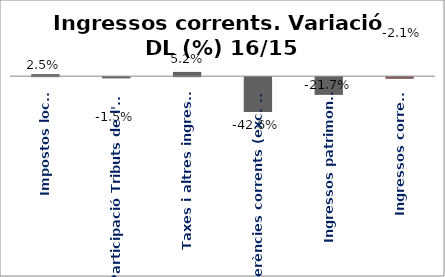
| Category | Series 0 |
|---|---|
| Impostos locals | 0.025 |
| Participació Tributs de l'Estat | -0.015 |
| Taxes i altres ingressos | 0.052 |
| Transferències corrents (exc. FCF) | -0.426 |
| Ingressos patrimonials | -0.217 |
| Ingressos corrents | -0.021 |